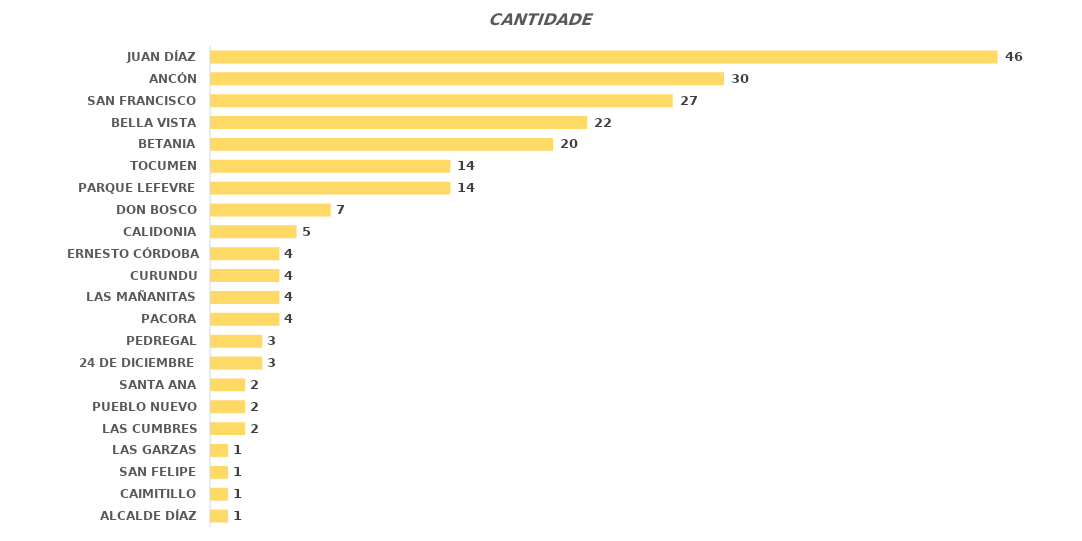
| Category | Total |
|---|---|
| ALCALDE DÍAZ | 1 |
| CAIMITILLO | 1 |
| SAN FELIPE | 1 |
| LAS GARZAS | 1 |
| LAS CUMBRES | 2 |
| PUEBLO NUEVO | 2 |
| SANTA ANA | 2 |
| 24 DE DICIEMBRE | 3 |
| PEDREGAL | 3 |
| PACORA | 4 |
| LAS MAÑANITAS | 4 |
| CURUNDU | 4 |
| ERNESTO CÓRDOBA CAMPOS | 4 |
| CALIDONIA | 5 |
| DON BOSCO | 7 |
| PARQUE LEFEVRE | 14 |
| TOCUMEN | 14 |
| BETANIA | 20 |
| BELLA VISTA | 22 |
| SAN FRANCISCO | 27 |
| ANCÓN | 30 |
| JUAN DÍAZ | 46 |